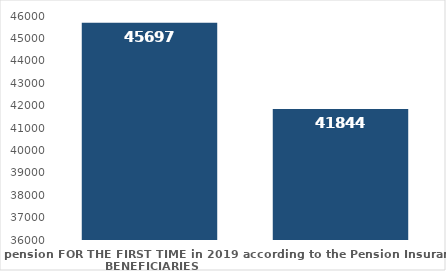
| Category | broj korisnika |
|---|---|
| Pension beneficiaries entitled to pension FOR THE FIRST TIME in 2019 according to the Pension Insurance Act  - NEW BENEFICIARIES | 45697 |
| Pension beneficiaries whose pension entitlement ceased in 2019  -  death caused,   
and who were retired according to the Pension Insurance Act   | 41844 |